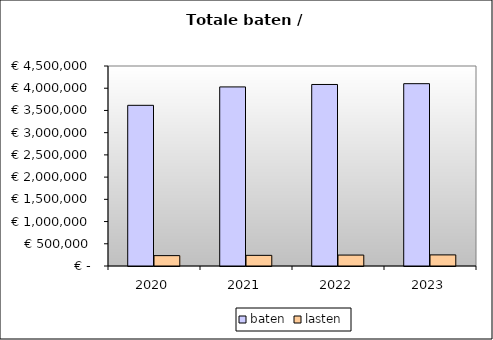
| Category | baten | lasten |
|---|---|---|
| 2020.0 | 3615157.406 | 233099.2 |
| 2021.0 | 4029486.511 | 239529.6 |
| 2022.0 | 4084213.149 | 246070.4 |
| 2023.0 | 4102359.139 | 249912 |